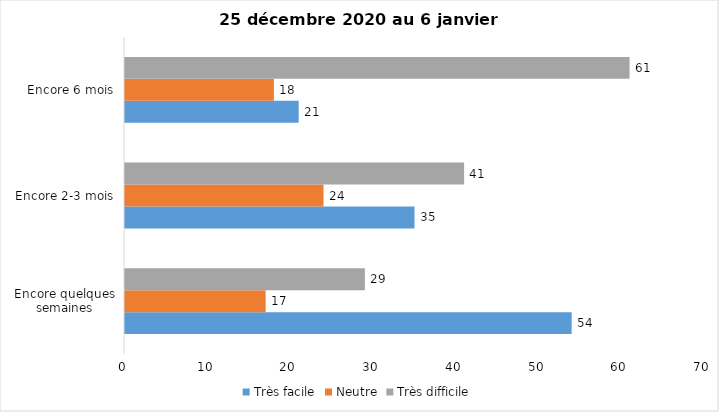
| Category | Très facile | Neutre | Très difficile |
|---|---|---|---|
| Encore quelques semaines | 54 | 17 | 29 |
| Encore 2-3 mois | 35 | 24 | 41 |
| Encore 6 mois | 21 | 18 | 61 |